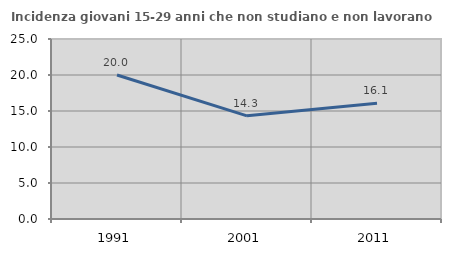
| Category | Incidenza giovani 15-29 anni che non studiano e non lavorano  |
|---|---|
| 1991.0 | 20 |
| 2001.0 | 14.327 |
| 2011.0 | 16.061 |